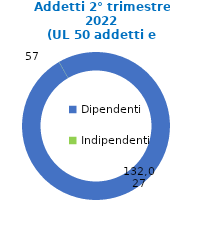
| Category | Series 0 |
|---|---|
| Dipendenti | 132027 |
| Indipendenti | 57 |